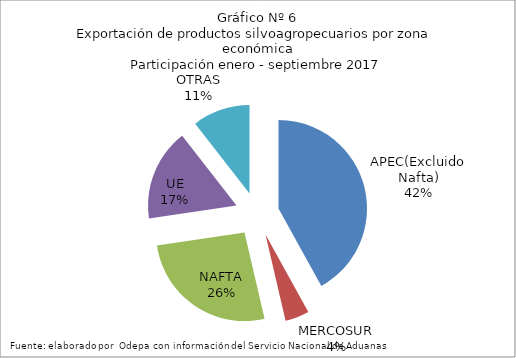
| Category | Series 0 |
|---|---|
| APEC(Excluido Nafta) | 5126045.833 |
| MERCOSUR | 537586.008 |
| NAFTA | 3209861.422 |
| UE | 2058617.814 |
| OTRAS | 1284752.924 |